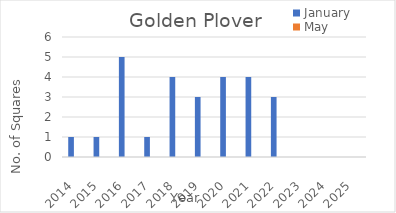
| Category | January | May |
|---|---|---|
| 2014.0 | 1 | 0 |
| 2015.0 | 1 | 0 |
| 2016.0 | 5 | 0 |
| 2017.0 | 1 | 0 |
| 2018.0 | 4 | 0 |
| 2019.0 | 3 | 0 |
| 2020.0 | 4 | 0 |
| 2021.0 | 4 | 0 |
| 2022.0 | 3 | 0 |
| 2023.0 | 0 | 0 |
| 2024.0 | 0 | 0 |
| 2025.0 | 0 | 0 |